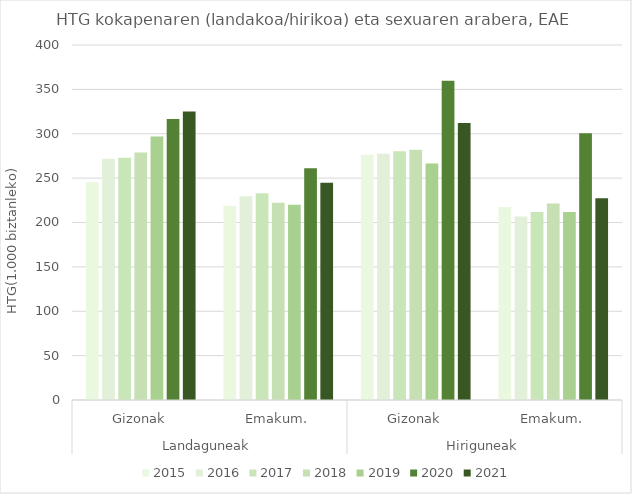
| Category | 2015 | 2016 | 2017 | 2018 | 2019 | 2020 | 2021 |
|---|---|---|---|---|---|---|---|
| 0 | 245.226 | 271.938 | 273.016 | 278.989 | 296.889 | 316.553 | 325.023 |
| 1 | 218.99 | 229.56 | 233.06 | 222.222 | 219.949 | 261.229 | 244.787 |
| 2 | 276.261 | 277.338 | 280.15 | 282.042 | 266.347 | 359.82 | 312.198 |
| 3 | 217.502 | 206.706 | 211.817 | 221.483 | 211.705 | 300.617 | 227.324 |